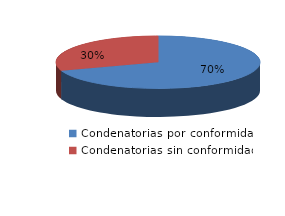
| Category | Series 0 |
|---|---|
| 0 | 231 |
| 1 | 100 |